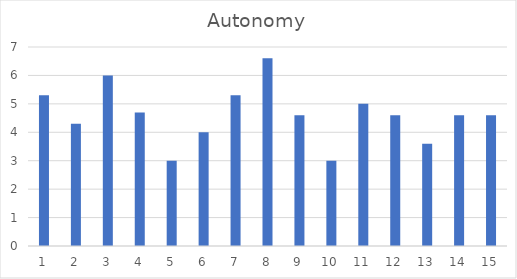
| Category | Autonomy |
|---|---|
| 0 | 5.3 |
| 1 | 4.3 |
| 2 | 6 |
| 3 | 4.7 |
| 4 | 3 |
| 5 | 4 |
| 6 | 5.3 |
| 7 | 6.6 |
| 8 | 4.6 |
| 9 | 3 |
| 10 | 5 |
| 11 | 4.6 |
| 12 | 3.6 |
| 13 | 4.6 |
| 14 | 4.6 |